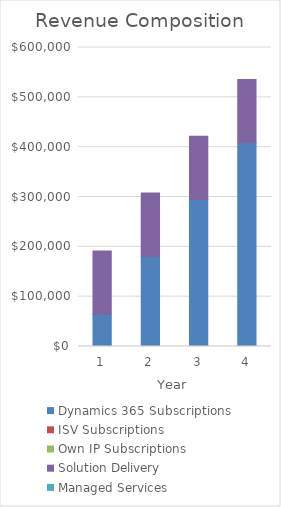
| Category | Dynamics 365 Subscriptions | ISV Subscriptions | Own IP Subscriptions | Solution Delivery | Managed Services |
|---|---|---|---|---|---|
| 1.0 | 64854.4 | 0 | 0 | 126900 | 0 |
| 2.0 | 181342.88 | 0 | 0 | 126900 | 0 |
| 3.0 | 295087.52 | 0 | 0 | 126900 | 0 |
| 4.0 | 408832.16 | 0 | 0 | 126900 | 0 |